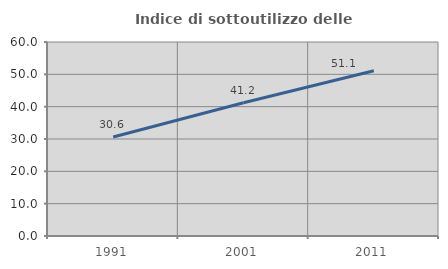
| Category | Indice di sottoutilizzo delle abitazioni  |
|---|---|
| 1991.0 | 30.612 |
| 2001.0 | 41.233 |
| 2011.0 | 51.095 |